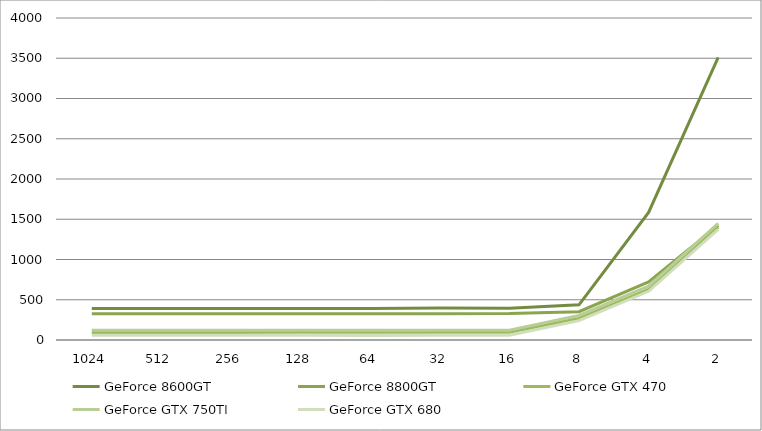
| Category | GeForce 8600GT | GeForce 8800GT | GeForce GTX 470 | GeForce GTX 750TI | GeForce GTX 680 |
|---|---|---|---|---|---|
| 1024.0 | 391 | 327 | 94 | 122 | 58 |
| 512.0 | 392 | 327 | 94 | 120 | 58 |
| 256.0 | 391 | 327 | 94 | 120 | 58 |
| 128.0 | 390 | 327 | 95 | 120 | 58 |
| 64.0 | 392 | 327 | 96 | 120 | 57 |
| 32.0 | 398 | 327 | 95 | 120 | 58 |
| 16.0 | 394 | 328 | 96 | 120 | 58 |
| 8.0 | 437 | 351 | 268 | 305 | 240 |
| 4.0 | 1585 | 721 | 629 | 668 | 605 |
| 2.0 | 3510 | 1424 | 1402 | 1450 | 1373 |